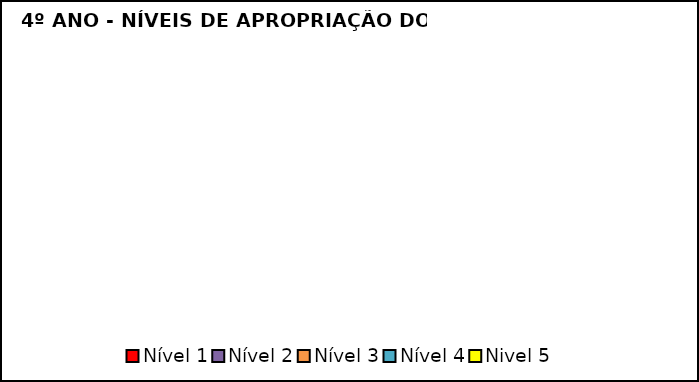
| Category | Series 0 |
|---|---|
| Nível 1 | 0 |
| Nível 2 | 0 |
| Nível 3 | 0 |
| Nível 4 | 0 |
| Nivel 5 | 0 |